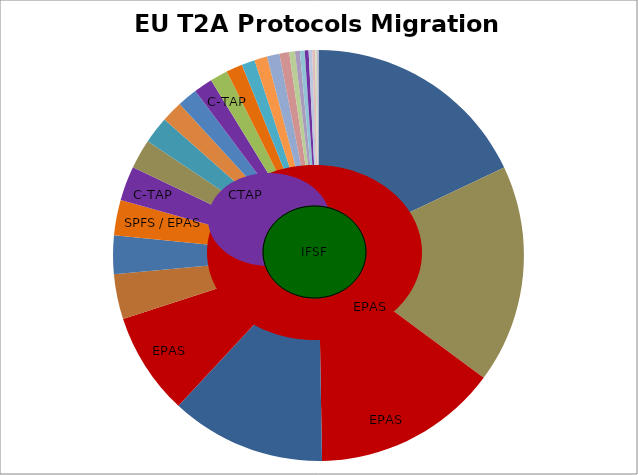
| Category | EU Terminals |
|---|---|
|  | 1653.91 |
|  | 1584.19 |
| EPAS | 1344.4 |
| PRICE
PRICE | 1125.05 |
| EPAS | 743.62 |
|  | 326.35 |
|  | 279.16 |
| SPFS / EPAS | 256.49 |
| C-TAP | 249.19 |
|  | 214.71 |
|  | 196 |
|  | 154.16 |
|  | 144.98 |
| C-TAP | 136.25 |